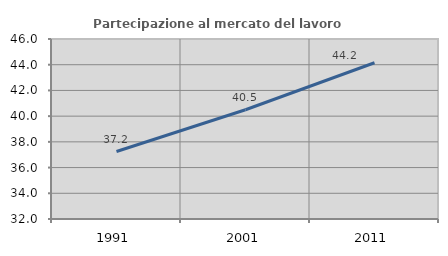
| Category | Partecipazione al mercato del lavoro  femminile |
|---|---|
| 1991.0 | 37.249 |
| 2001.0 | 40.498 |
| 2011.0 | 44.151 |